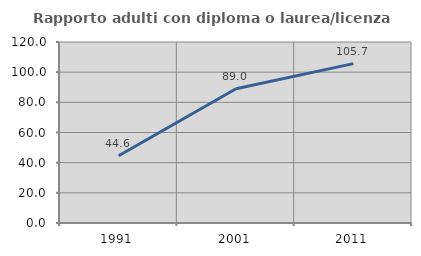
| Category | Rapporto adulti con diploma o laurea/licenza media  |
|---|---|
| 1991.0 | 44.554 |
| 2001.0 | 88.983 |
| 2011.0 | 105.66 |